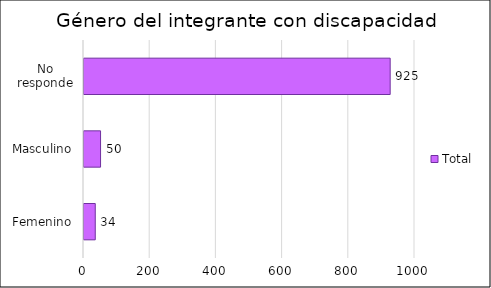
| Category | Total |
|---|---|
| Femenino | 34 |
| Masculino | 50 |
| No responde | 925 |